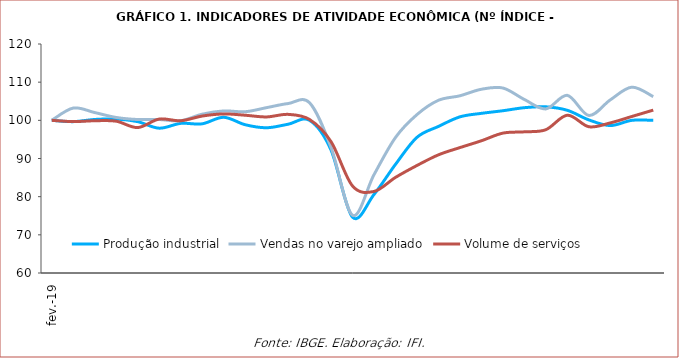
| Category | Produção industrial | Vendas no varejo ampliado | Volume de serviços |
|---|---|---|---|
| 2019-02-01 | 100 | 100 | 100 |
| 2019-03-01 | 99.657 | 103.215 | 99.665 |
| 2019-04-01 | 100.229 | 102.036 | 99.888 |
| 2019-05-01 | 100.343 | 100.75 | 99.777 |
| 2019-06-01 | 99.657 | 100.214 | 98.103 |
| 2019-07-01 | 97.943 | 100.214 | 100.335 |
| 2019-08-01 | 99.2 | 99.893 | 99.888 |
| 2019-09-01 | 99.086 | 101.608 | 101.116 |
| 2019-10-01 | 100.8 | 102.465 | 101.674 |
| 2019-11-01 | 98.857 | 102.251 | 101.339 |
| 2019-12-01 | 98.057 | 103.323 | 100.893 |
| 2020-01-01 | 98.971 | 104.394 | 101.562 |
| 2020-02-01 | 100 | 104.609 | 100.223 |
| 2020-03-01 | 92.229 | 92.926 | 94.42 |
| 2020-04-01 | 74.629 | 75.134 | 82.812 |
| 2020-05-01 | 80.571 | 85.745 | 81.362 |
| 2020-06-01 | 88.457 | 95.498 | 85.045 |
| 2020-07-01 | 95.543 | 101.501 | 88.17 |
| 2020-08-01 | 98.4 | 105.252 | 90.96 |
| 2020-09-01 | 100.914 | 106.431 | 92.857 |
| 2020-10-01 | 101.829 | 108.146 | 94.643 |
| 2020-11-01 | 102.514 | 108.467 | 96.652 |
| 2020-12-01 | 103.314 | 105.466 | 96.987 |
| 2021-01-01 | 103.543 | 103.001 | 97.545 |
| 2021-02-01 | 102.629 | 106.538 | 101.339 |
| 2021-03-01 | 100.114 | 101.286 | 98.326 |
| 2021-04-01 | 98.629 | 105.359 | 99.33 |
| 2021-05-01 | 100 | 108.682 | 101.004 |
| 2021-06-01 | 100 | 106.217 | 102.679 |